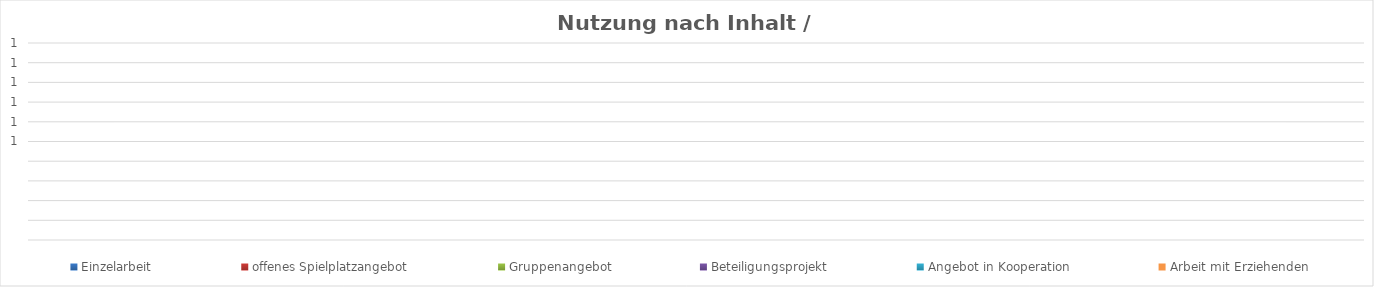
| Category | Einzelarbeit | offenes Spielplatzangebot | Gruppenangebot | Beteiligungsprojekt | Angebot in Kooperation | Arbeit mit Erziehenden |
|---|---|---|---|---|---|---|
| 0 | 0 | 0 | 0 | 0 | 0 | 0 |